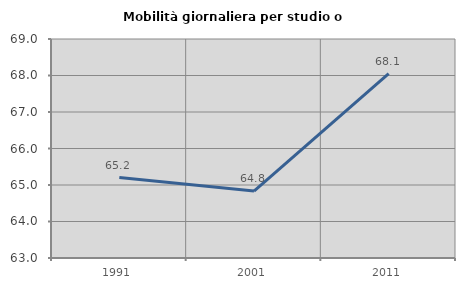
| Category | Mobilità giornaliera per studio o lavoro |
|---|---|
| 1991.0 | 65.204 |
| 2001.0 | 64.834 |
| 2011.0 | 68.053 |